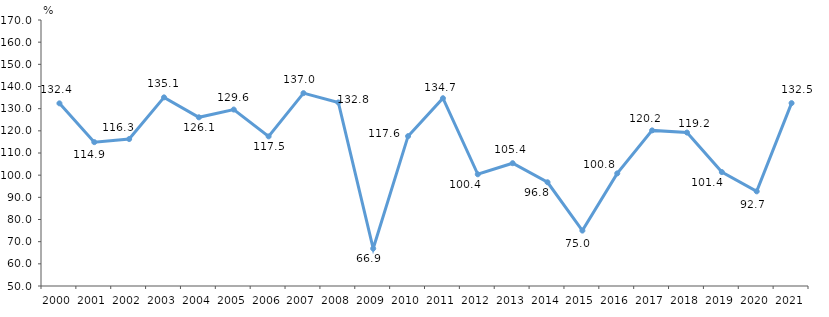
| Category | IMPORT |
|---|---|
| 2000.0 | 132.4 |
| 2001.0 | 114.9 |
| 2002.0 | 116.3 |
| 2003.0 | 135.1 |
| 2004.0 | 126.1 |
| 2005.0 | 129.6 |
| 2006.0 | 117.5 |
| 2007.0 | 137 |
| 2008.0 | 132.8 |
| 2009.0 | 66.9 |
| 2010.0 | 117.6 |
| 2011.0 | 134.7 |
| 2012.0 | 100.4 |
| 2013.0 | 105.4 |
| 2014.0 | 96.8 |
| 2015.0 | 75 |
| 2016.0 | 100.8 |
| 2017.0 | 120.2 |
| 2018.0 | 119.223 |
| 2019.0 | 101.4 |
| 2020.0 | 92.7 |
| 2021.0 | 132.5 |